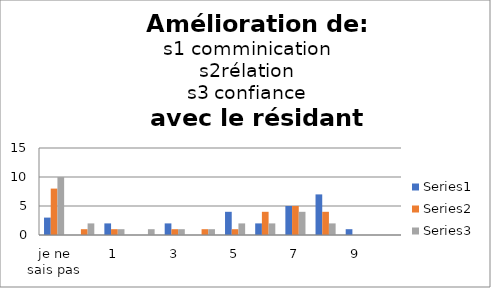
| Category | Series 0 | Series 1 | Series 2 |
|---|---|---|---|
| je ne sais pas | 3 | 8 | 10 |
| 0 | 0 | 1 | 2 |
| 1 | 2 | 1 | 1 |
| 2 | 0 | 0 | 1 |
| 3 | 2 | 1 | 1 |
| 4 | 0 | 1 | 1 |
| 5 | 4 | 1 | 2 |
| 6 | 2 | 4 | 2 |
| 7 | 5 | 5 | 4 |
| 8 | 7 | 4 | 2 |
| 9 | 1 | 0 | 0 |
| 10 | 0 | 0 | 0 |